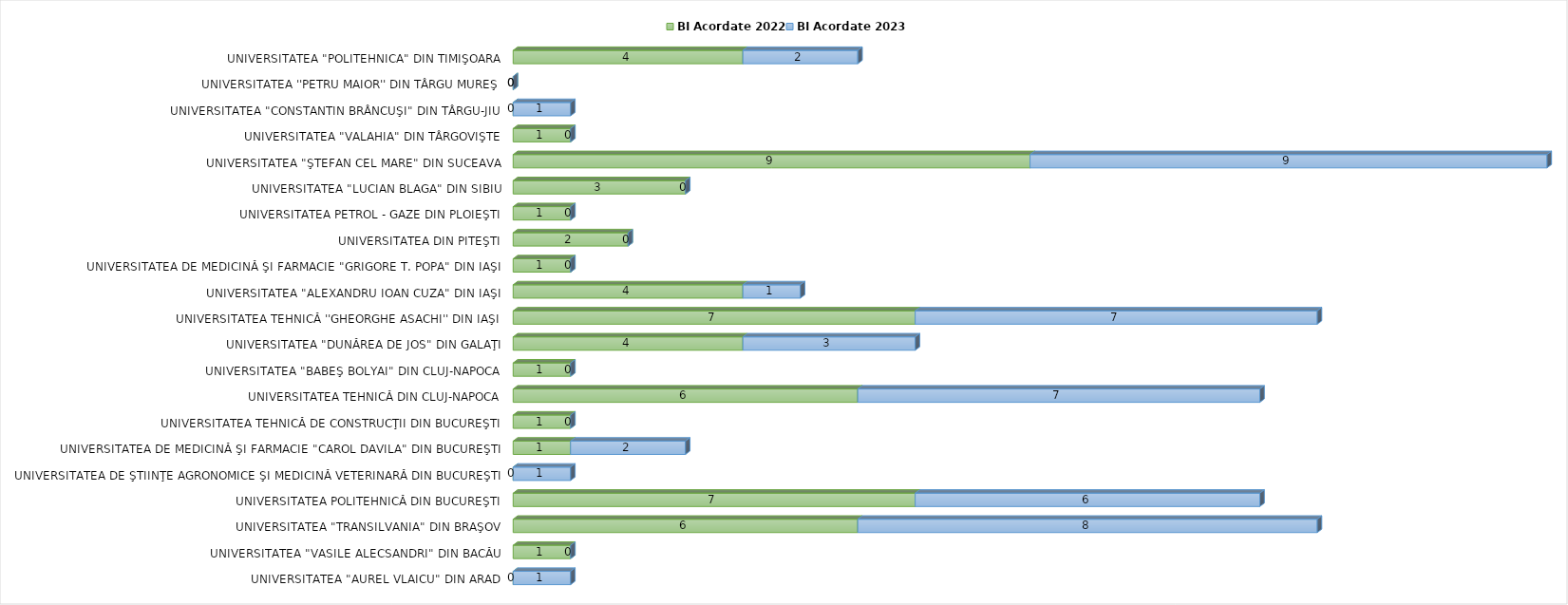
| Category | BI Acordate 2022 | BI Acordate 2023 |
|---|---|---|
| UNIVERSITATEA "AUREL VLAICU" DIN ARAD | 0 | 1 |
| UNIVERSITATEA "VASILE ALECSANDRI" DIN BACĂU | 1 | 0 |
| UNIVERSITATEA "TRANSILVANIA" DIN BRAŞOV | 6 | 8 |
| UNIVERSITATEA POLITEHNICĂ DIN BUCUREŞTI | 7 | 6 |
| UNIVERSITATEA DE ŞTIINŢE AGRONOMICE ŞI MEDICINĂ VETERINARĂ DIN BUCUREŞTI | 0 | 1 |
| UNIVERSITATEA DE MEDICINĂ ŞI FARMACIE "CAROL DAVILA" DIN BUCUREŞTI | 1 | 2 |
| UNIVERSITATEA TEHNICĂ DE CONSTRUCŢII DIN BUCUREŞTI | 1 | 0 |
| UNIVERSITATEA TEHNICĂ DIN CLUJ-NAPOCA | 6 | 7 |
| UNIVERSITATEA "BABEŞ BOLYAI" DIN CLUJ-NAPOCA | 1 | 0 |
| UNIVERSITATEA "DUNĂREA DE JOS" DIN GALAŢI | 4 | 3 |
| UNIVERSITATEA TEHNICĂ ''GHEORGHE ASACHI'' DIN IAŞI | 7 | 7 |
| UNIVERSITATEA "ALEXANDRU IOAN CUZA" DIN IAŞI | 4 | 1 |
| UNIVERSITATEA DE MEDICINĂ ŞI FARMACIE "GRIGORE T. POPA" DIN IAŞI | 1 | 0 |
| UNIVERSITATEA DIN PITEŞTI | 2 | 0 |
| UNIVERSITATEA PETROL - GAZE DIN PLOIEŞTI | 1 | 0 |
| UNIVERSITATEA "LUCIAN BLAGA" DIN SIBIU | 3 | 0 |
| UNIVERSITATEA "ŞTEFAN CEL MARE" DIN SUCEAVA | 9 | 9 |
| UNIVERSITATEA "VALAHIA" DIN TÂRGOVIŞTE | 1 | 0 |
| UNIVERSITATEA "CONSTANTIN BRÂNCUŞI" DIN TÂRGU-JIU | 0 | 1 |
| UNIVERSITATEA ''PETRU MAIOR'' DIN TÂRGU MUREŞ | 0 | 0 |
| UNIVERSITATEA "POLITEHNICA" DIN TIMIŞOARA | 4 | 2 |